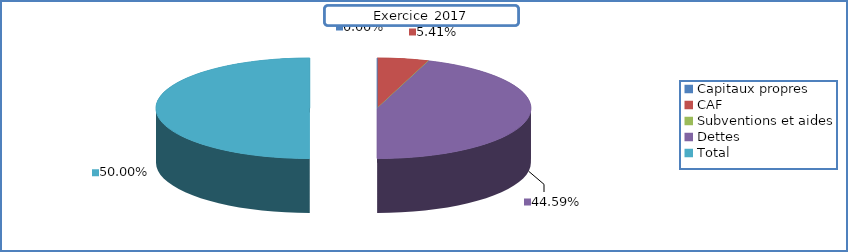
| Category | Series 0 |
|---|---|
| Capitaux propres | 0 |
| CAF | 8505.667 |
| Subventions et aides | 0 |
| Dettes | 70045.133 |
| Total | 78550.8 |